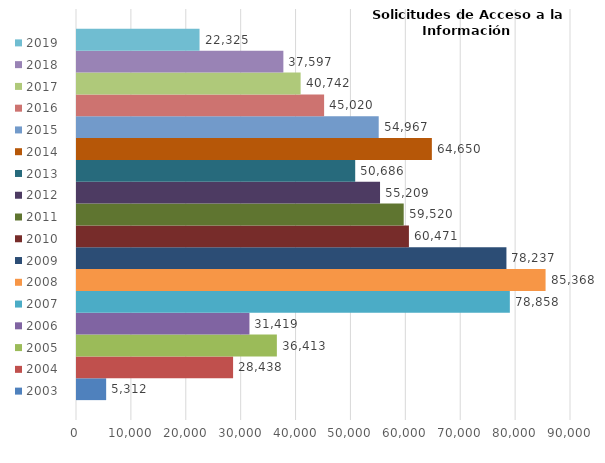
| Category | 2003 | 2004 | 2005 | 2006 | 2007 | 2008 | 2009 | 2010 | 2011 | 2012 | 2013 | 2014 | 2015 | 2016 | 2017 | 2018 | 2019 |
|---|---|---|---|---|---|---|---|---|---|---|---|---|---|---|---|---|---|
| 0 | 5312 | 28438 | 36413 | 31419 | 78858 | 85368 | 78237 | 60471 | 59520 | 55209 | 50686 | 64650 | 54967 | 45020 | 40742 | 37597 | 22325 |